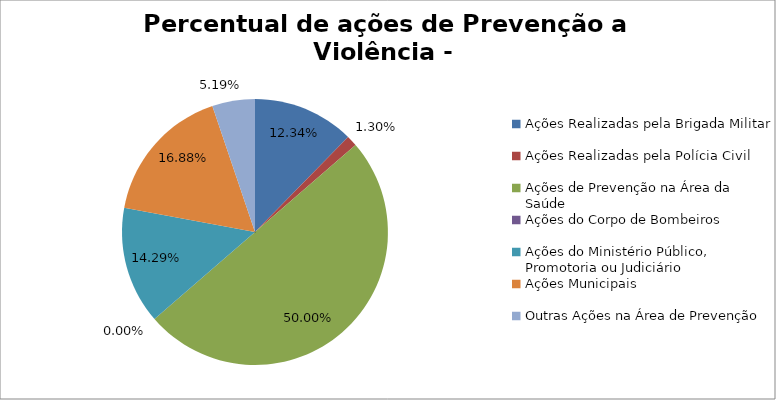
| Category | Percentual |
|---|---|
| Ações Realizadas pela Brigada Militar | 0.123 |
| Ações Realizadas pela Polícia Civil | 0.013 |
| Ações de Prevenção na Área da Saúde | 0.5 |
| Ações do Corpo de Bombeiros | 0 |
| Ações do Ministério Público, Promotoria ou Judiciário | 0.143 |
| Ações Municipais | 0.169 |
| Outras Ações na Área de Prevenção | 0.052 |